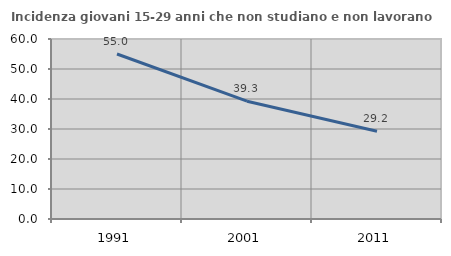
| Category | Incidenza giovani 15-29 anni che non studiano e non lavorano  |
|---|---|
| 1991.0 | 55 |
| 2001.0 | 39.267 |
| 2011.0 | 29.247 |